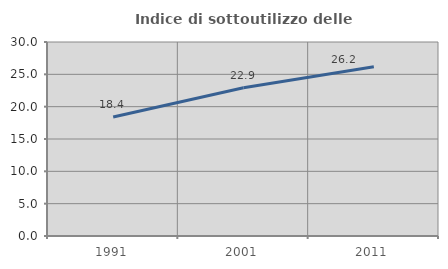
| Category | Indice di sottoutilizzo delle abitazioni  |
|---|---|
| 1991.0 | 18.406 |
| 2001.0 | 22.936 |
| 2011.0 | 26.173 |